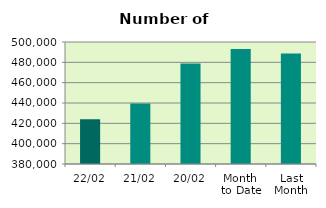
| Category | Series 0 |
|---|---|
| 22/02 | 424012 |
| 21/02 | 439606 |
| 20/02 | 478796 |
| Month 
to Date | 493134.75 |
| Last
Month | 488780.727 |